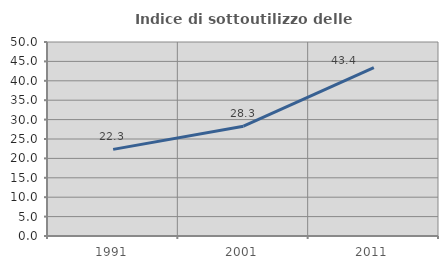
| Category | Indice di sottoutilizzo delle abitazioni  |
|---|---|
| 1991.0 | 22.321 |
| 2001.0 | 28.288 |
| 2011.0 | 43.382 |